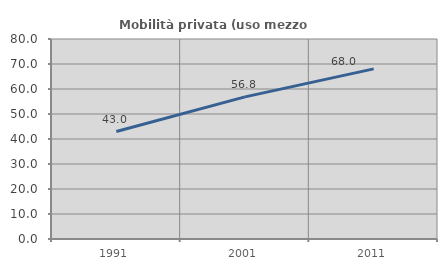
| Category | Mobilità privata (uso mezzo privato) |
|---|---|
| 1991.0 | 42.978 |
| 2001.0 | 56.845 |
| 2011.0 | 68.041 |